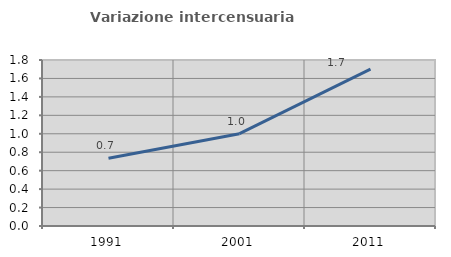
| Category | Variazione intercensuaria annua |
|---|---|
| 1991.0 | 0.734 |
| 2001.0 | 1.001 |
| 2011.0 | 1.701 |